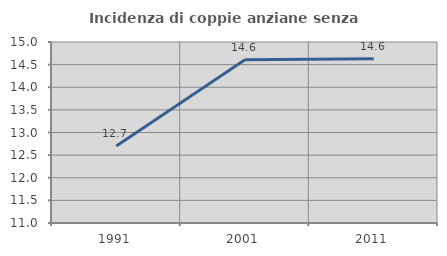
| Category | Incidenza di coppie anziane senza figli  |
|---|---|
| 1991.0 | 12.704 |
| 2001.0 | 14.605 |
| 2011.0 | 14.63 |